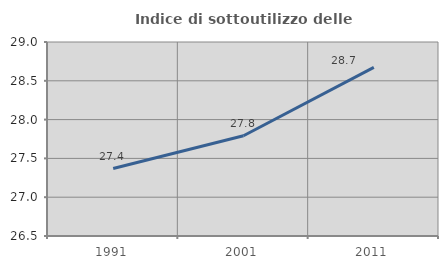
| Category | Indice di sottoutilizzo delle abitazioni  |
|---|---|
| 1991.0 | 27.369 |
| 2001.0 | 27.792 |
| 2011.0 | 28.673 |